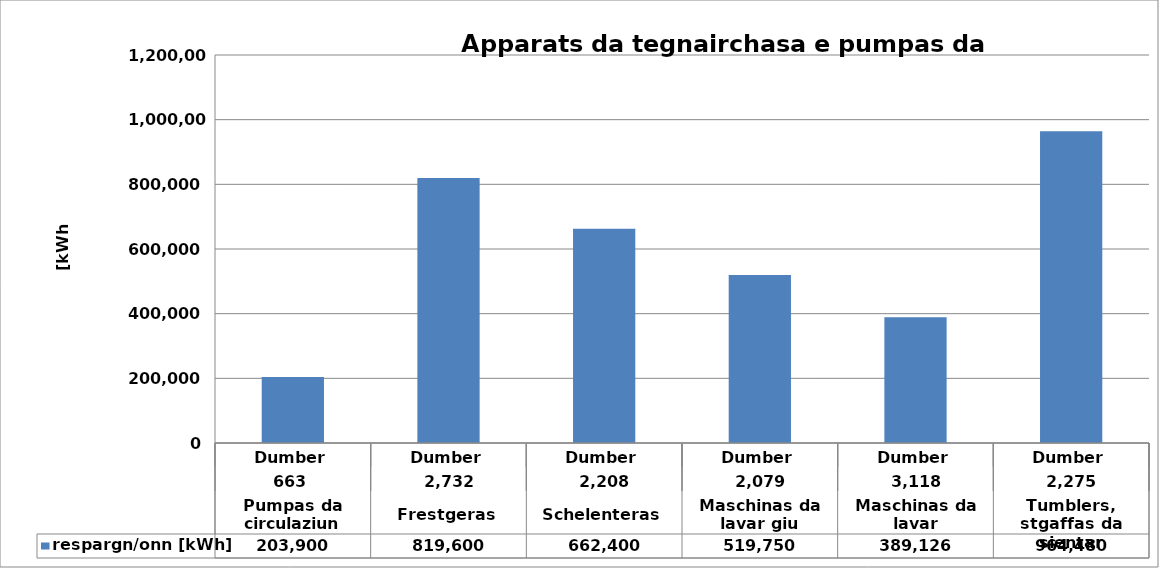
| Category | respargn/onn [kWh] |
|---|---|
| 0 | 203900 |
| 1 | 819600 |
| 2 | 662400 |
| 3 | 519750 |
| 4 | 389126.4 |
| 5 | 964480 |